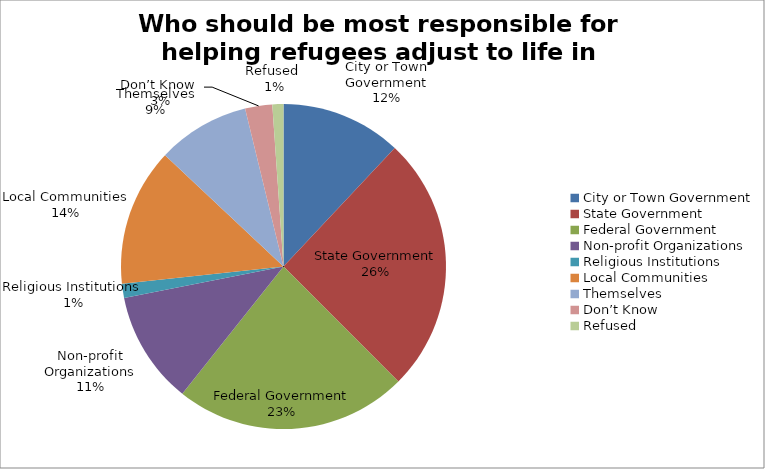
| Category | Valid Percent | Percent | Frequency |
|---|---|---|---|
| City or Town Government | 12 | 12 | 65 |
| State Government | 25.5 | 25.6 | 138 |
| Federal Government | 23.2 | 23.2 | 125 |
| Non-profit Organizations | 11.2 | 11.3 | 61 |
| Religious Institutions  | 1.4 | 1.3 | 7 |
| Local Communities | 13.7 | 13.7 | 74 |
| Themselves | 9.2 | 9.3 | 50 |
| Don’t Know  | 2.7 | 2.8 | 15 |
| Refused  | 1.1 | 1.1 | 6 |